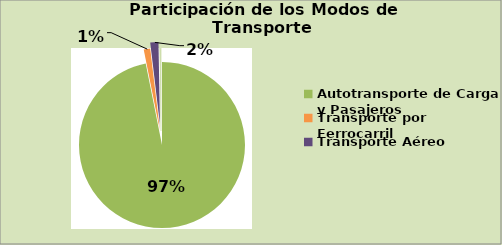
| Category | Series 0 |
|---|---|
| Autotransporte de Carga y Pasajeros | 3363000 |
| Transporte por Ferrocarril | 43830 |
| Transporte Aéreo | 55103 |
| Transporte por Agua | 10260 |